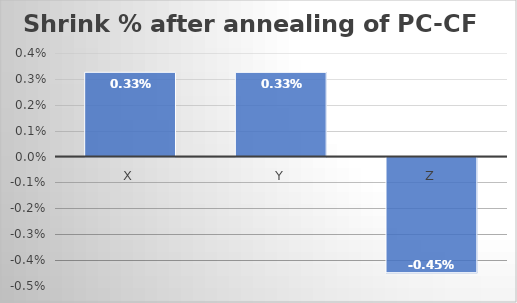
| Category | Shrink % |
|---|---|
| X | 0.003 |
| Y | 0.003 |
| Z | -0.004 |